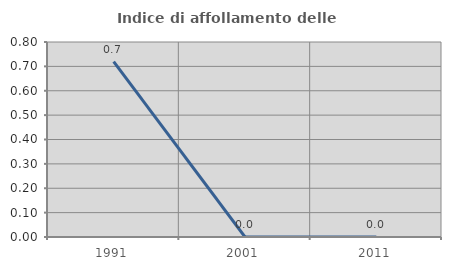
| Category | Indice di affollamento delle abitazioni  |
|---|---|
| 1991.0 | 0.719 |
| 2001.0 | 0 |
| 2011.0 | 0 |